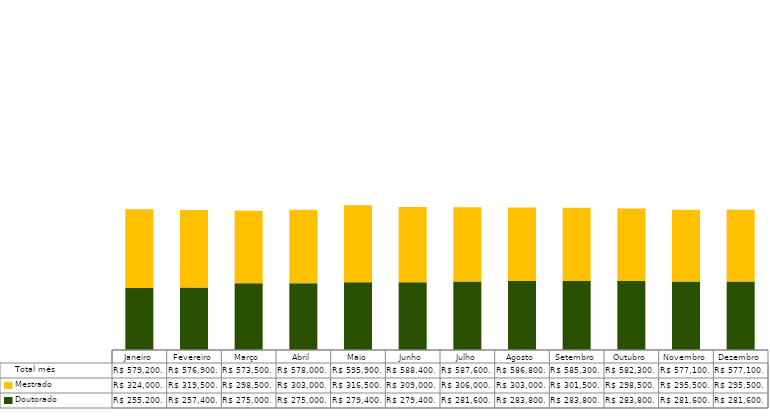
| Category | Doutorado                      | Mestrado                       | Total mês |
|---|---|---|---|
| Janeiro | 255200 | 324000 | 579200 |
| Fevereiro | 257400 | 319500 | 576900 |
| Março | 275000 | 298500 | 573500 |
| Abril | 275000 | 303000 | 578000 |
| Maio | 279400 | 316500 | 595900 |
| Junho | 279400 | 309000 | 588400 |
| Julho | 281600 | 306000 | 587600 |
| Agosto | 283800 | 303000 | 586800 |
| Setembro | 283800 | 301500 | 585300 |
| Outubro | 283800 | 298500 | 582300 |
| Novembro | 281600 | 295500 | 577100 |
| Dezembro | 281600 | 295500 | 577100 |